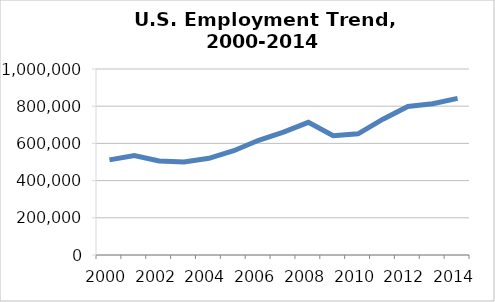
| Category | Series 0 |
|---|---|
| 2000.0 | 511403 |
| 2001.0 | 535189 |
| 2002.0 | 505979 |
| 2003.0 | 500103 |
| 2004.0 | 519931 |
| 2005.0 | 560416 |
| 2006.0 | 616598 |
| 2007.0 | 660276 |
| 2008.0 | 713398 |
| 2009.0 | 641366 |
| 2010.0 | 651631 |
| 2011.0 | 730048 |
| 2012.0 | 798132 |
| 2013.0 | 813258 |
| 2014.0 | 841789 |